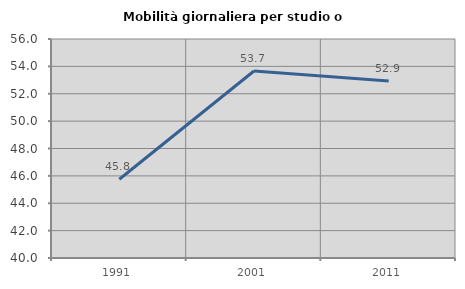
| Category | Mobilità giornaliera per studio o lavoro |
|---|---|
| 1991.0 | 45.755 |
| 2001.0 | 53.664 |
| 2011.0 | 52.938 |